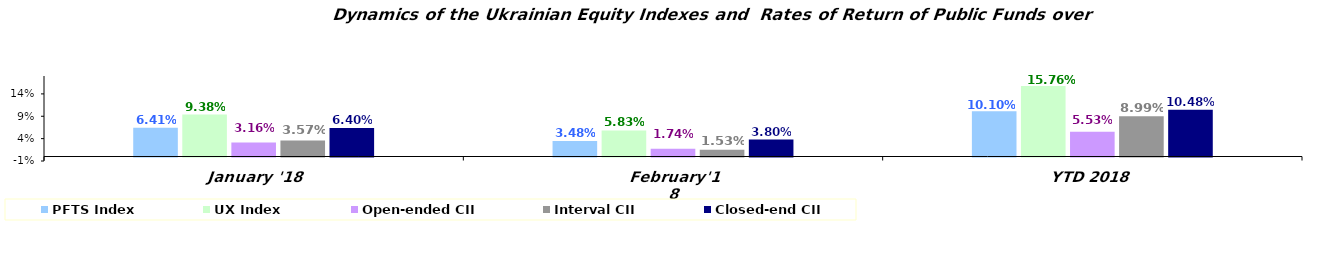
| Category | PFTS Index | UX Index | Open-ended CII | Interval CII | Closed-end CII |
|---|---|---|---|---|---|
| January '18 | 0.064 | 0.094 | 0.032 | 0.036 | 0.064 |
| February'18 | 0.035 | 0.058 | 0.017 | 0.015 | 0.038 |
| YTD 2018 | 0.101 | 0.158 | 0.055 | 0.09 | 0.105 |